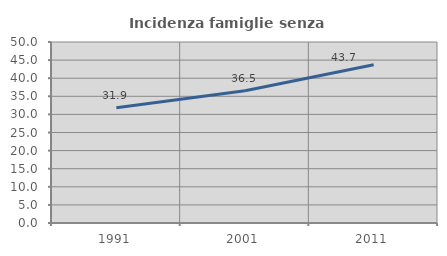
| Category | Incidenza famiglie senza nuclei |
|---|---|
| 1991.0 | 31.858 |
| 2001.0 | 36.538 |
| 2011.0 | 43.706 |